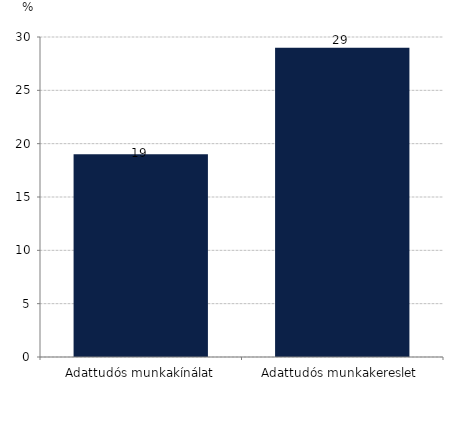
| Category | 2018-as éves változás |
|---|---|
| Adattudós munkakínálat | 19 |
| Adattudós munkakereslet  | 29 |